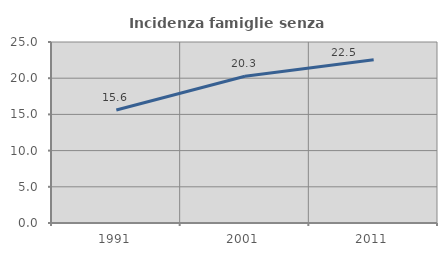
| Category | Incidenza famiglie senza nuclei |
|---|---|
| 1991.0 | 15.607 |
| 2001.0 | 20.263 |
| 2011.0 | 22.533 |